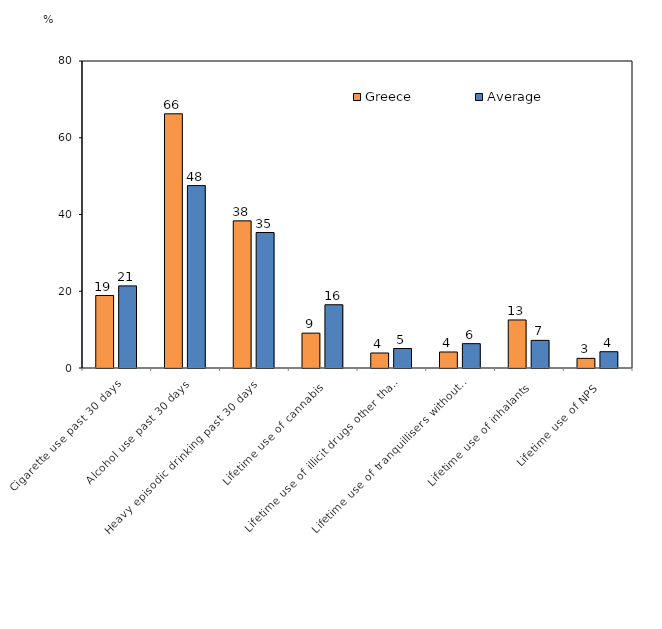
| Category | Greece | Average |
|---|---|---|
| Cigarette use past 30 days | 18.89 | 21.397 |
| Alcohol use past 30 days | 66.24 | 47.531 |
| Heavy episodic drinking past 30 days | 38.34 | 35.309 |
| Lifetime use of cannabis | 9.08 | 16.48 |
| Lifetime use of illicit drugs other than cannabis | 3.91 | 5.079 |
| Lifetime use of tranquillisers without prescription  | 4.17 | 6.34 |
| Lifetime use of inhalants | 12.52 | 7.202 |
| Lifetime use of NPS | 2.51 | 4.246 |